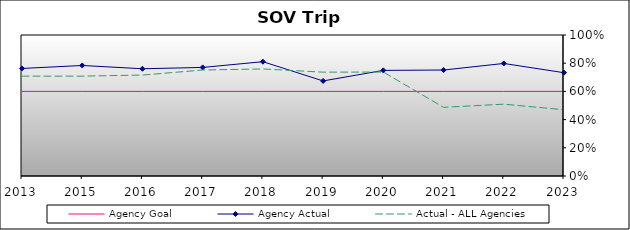
| Category | Agency Goal | Agency Actual | Actual - ALL Agencies |
|---|---|---|---|
| 2013.0 | 0.6 | 0.763 | 0.708 |
| 2015.0 | 0.6 | 0.784 | 0.708 |
| 2016.0 | 0.6 | 0.761 | 0.716 |
| 2017.0 | 0.6 | 0.77 | 0.752 |
| 2018.0 | 0.6 | 0.811 | 0.759 |
| 2019.0 | 0.6 | 0.674 | 0.736 |
| 2020.0 | 0.6 | 0.749 | 0.737 |
| 2021.0 | 0.6 | 0.752 | 0.487 |
| 2022.0 | 0.6 | 0.798 | 0.509 |
| 2023.0 | 0.6 | 0.733 | 0.47 |